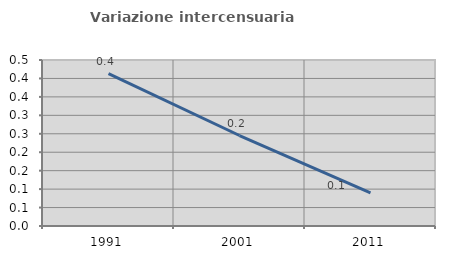
| Category | Variazione intercensuaria annua |
|---|---|
| 1991.0 | 0.413 |
| 2001.0 | 0.245 |
| 2011.0 | 0.09 |